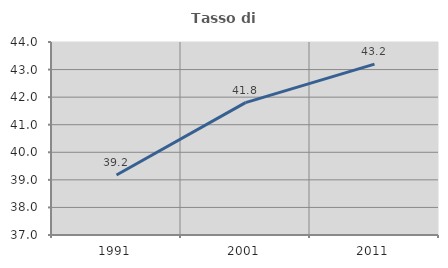
| Category | Tasso di occupazione   |
|---|---|
| 1991.0 | 39.177 |
| 2001.0 | 41.802 |
| 2011.0 | 43.198 |